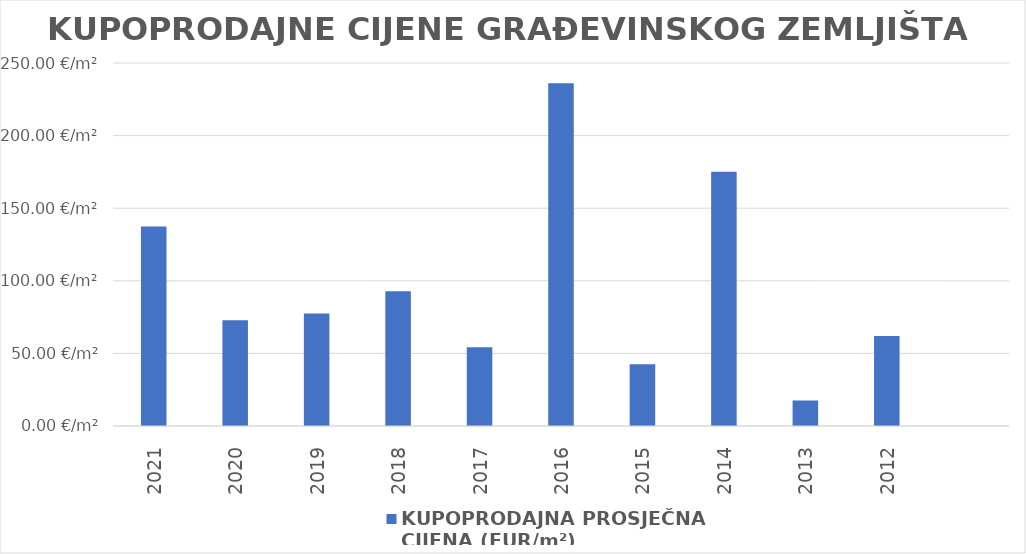
| Category | KUPOPRODAJNA PROSJEČNA 
CIJENA (EUR/m²) |
|---|---|
| 2021 | 1900-05-16 11:18:16 |
| 2020 | 1900-03-12 21:14:30 |
| 2019 | 1900-03-17 11:54:36 |
| 2018 | 1900-04-01 18:01:16 |
| 2017 | 1900-02-23 06:47:19 |
| 2016 | 1900-08-23 00:13:18 |
| 2015 | 1900-02-11 11:28:59 |
| 2014 | 1900-06-23 04:07:48 |
| 2013 | 1900-01-17 13:55:30 |
| 2012 | 1900-03-02 01:09:22 |